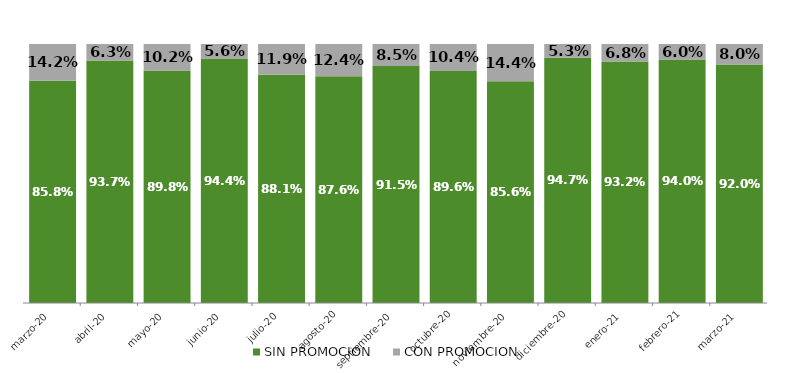
| Category | SIN PROMOCION   | CON PROMOCION   |
|---|---|---|
| 2020-03-01 | 0.858 | 0.142 |
| 2020-04-01 | 0.937 | 0.063 |
| 2020-05-01 | 0.898 | 0.102 |
| 2020-06-01 | 0.944 | 0.056 |
| 2020-07-01 | 0.881 | 0.119 |
| 2020-08-01 | 0.876 | 0.124 |
| 2020-09-01 | 0.915 | 0.085 |
| 2020-10-01 | 0.896 | 0.104 |
| 2020-11-01 | 0.856 | 0.144 |
| 2020-12-01 | 0.947 | 0.053 |
| 2021-01-01 | 0.932 | 0.068 |
| 2021-02-01 | 0.94 | 0.06 |
| 2021-03-01 | 0.92 | 0.08 |